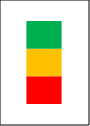
| Category | Series 0 | Series 1 | Series 2 |
|---|---|---|---|
| Summe11-16 | 0.2 | 0.2 | 0.2 |